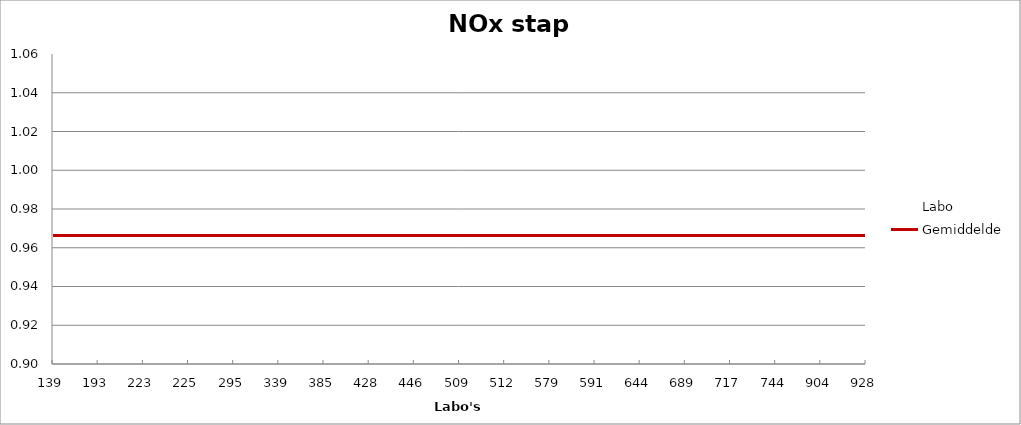
| Category | Labo | Gemiddelde |
|---|---|---|
| 139.0 | 0.968 | 0.966 |
| 193.0 | 0.976 | 0.966 |
| 223.0 | 0.978 | 0.966 |
| 225.0 | 0.991 | 0.966 |
| 295.0 | 0.959 | 0.966 |
| 339.0 | 0.951 | 0.966 |
| 385.0 | 0.959 | 0.966 |
| 428.0 | 1.019 | 0.966 |
| 446.0 | 0.972 | 0.966 |
| 509.0 | 0.924 | 0.966 |
| 512.0 | 0.961 | 0.966 |
| 579.0 | 0.995 | 0.966 |
| 591.0 | 1.006 | 0.966 |
| 644.0 | 0.995 | 0.966 |
| 689.0 | 0.939 | 0.966 |
| 717.0 | 0.919 | 0.966 |
| 744.0 | 0.986 | 0.966 |
| 904.0 | 0.95 | 0.966 |
| 928.0 | 0.917 | 0.966 |